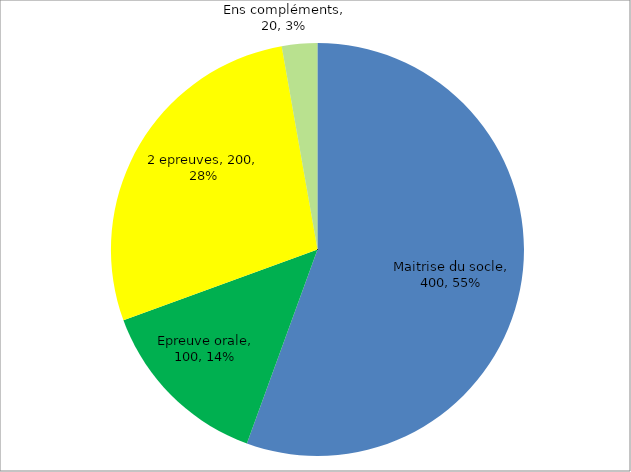
| Category | Series 0 |
|---|---|
| Maitrise du socle | 400 |
| Epreuve orale | 100 |
| 2 epreuves | 200 |
| Ens compléments | 20 |